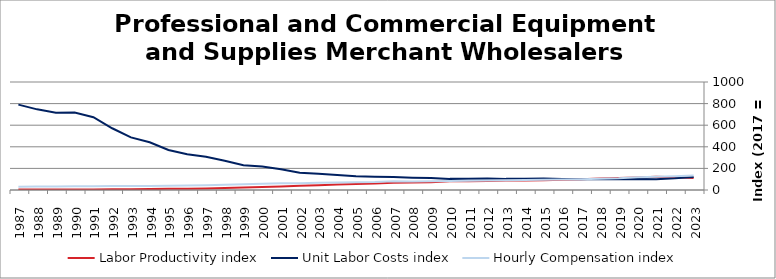
| Category | Labor Productivity index | Unit Labor Costs index | Hourly Compensation index |
|---|---|---|---|
| 2023.0 | 110.514 | 121.023 | 133.748 |
| 2022.0 | 118.4 | 108.085 | 127.973 |
| 2021.0 | 122.728 | 100.159 | 122.923 |
| 2020.0 | 114.703 | 102.294 | 117.334 |
| 2019.0 | 110.11 | 98.75 | 108.734 |
| 2018.0 | 105.38 | 99.826 | 105.197 |
| 2017.0 | 100 | 100 | 100 |
| 2016.0 | 94.853 | 102.35 | 97.082 |
| 2015.0 | 90.135 | 106.496 | 95.99 |
| 2014.0 | 88.122 | 104.413 | 92.011 |
| 2013.0 | 87.25 | 103.011 | 89.877 |
| 2012.0 | 83.152 | 106.543 | 88.592 |
| 2011.0 | 81.39 | 105.272 | 85.681 |
| 2010.0 | 80.985 | 103.011 | 83.424 |
| 2009.0 | 71.721 | 111.981 | 80.313 |
| 2008.0 | 69.173 | 114.578 | 79.257 |
| 2007.0 | 66.756 | 120.582 | 80.495 |
| 2006.0 | 59.584 | 123.84 | 73.789 |
| 2005.0 | 55.744 | 127.522 | 71.085 |
| 2004.0 | 50.357 | 138.05 | 69.518 |
| 2003.0 | 43.827 | 150.901 | 66.136 |
| 2002.0 | 39.467 | 159.624 | 62.999 |
| 2001.0 | 32.989 | 191.268 | 63.098 |
| 2000.0 | 26.819 | 216.83 | 58.152 |
| 1999.0 | 23.555 | 229.314 | 54.014 |
| 1998.0 | 18.051 | 270.132 | 48.761 |
| 1997.0 | 14.173 | 307.482 | 43.58 |
| 1996.0 | 12.38 | 330.361 | 40.899 |
| 1995.0 | 10.418 | 371.082 | 38.659 |
| 1994.0 | 8.431 | 441.54 | 37.225 |
| 1993.0 | 7.83 | 486.938 | 38.128 |
| 1992.0 | 6.606 | 571.577 | 37.758 |
| 1991.0 | 5.251 | 674.126 | 35.395 |
| 1990.0 | 4.774 | 716.975 | 34.23 |
| 1989.0 | 4.544 | 715.974 | 32.533 |
| 1988.0 | 4.188 | 746.699 | 31.27 |
| 1987.0 | 3.898 | 790.43 | 30.813 |